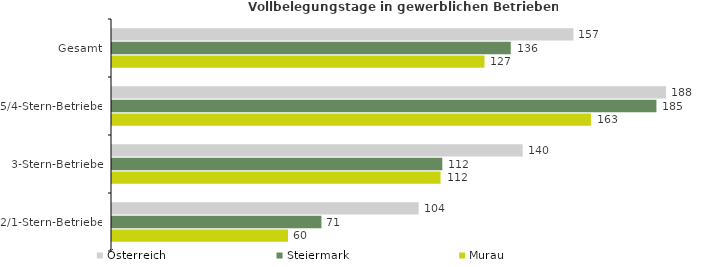
| Category | Österreich | Steiermark | Murau |
|---|---|---|---|
| Gesamt | 156.946 | 135.634 | 126.694 |
| 5/4-Stern-Betriebe | 188.443 | 185.178 | 162.911 |
| 3-Stern-Betriebe | 139.696 | 112.345 | 111.749 |
| 2/1-Stern-Betriebe | 104.286 | 71.229 | 59.873 |